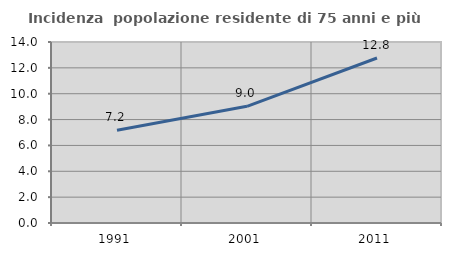
| Category | Incidenza  popolazione residente di 75 anni e più |
|---|---|
| 1991.0 | 7.171 |
| 2001.0 | 9.026 |
| 2011.0 | 12.762 |